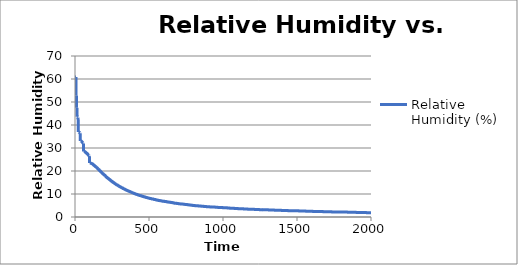
| Category | Relative Humidity (%) |
|---|---|
| 0.0 | 60.8 |
| 1.0 | 60.8 |
| 2.0 | 60.8 |
| 3.0 | 60.8 |
| 4.0 | 60.9 |
| 5.0 | 60.9 |
| 6.0 | 60.9 |
| 7.0 | 52.8 |
| 8.0 | 52.8 |
| 9.0 | 52.8 |
| 10.0 | 52.8 |
| 11.0 | 47.5 |
| 12.0 | 47.5 |
| 13.0 | 47.5 |
| 14.0 | 43.6 |
| 15.0 | 43.6 |
| 16.0 | 43.6 |
| 17.0 | 43.6 |
| 18.0 | 43.3 |
| 19.0 | 43.3 |
| 20.0 | 43.3 |
| 21.0 | 43.3 |
| 22.0 | 37 |
| 23.0 | 37 |
| 24.0 | 37 |
| 25.0 | 36.9 |
| 26.0 | 36.9 |
| 27.0 | 36.9 |
| 28.0 | 36.9 |
| 29.0 | 36.7 |
| 30.0 | 36.7 |
| 31.0 | 36.7 |
| 32.0 | 36.7 |
| 33.0 | 36.4 |
| 34.0 | 36.4 |
| 35.0 | 36.4 |
| 36.0 | 33.1 |
| 37.0 | 33.1 |
| 38.0 | 33.1 |
| 39.0 | 33.1 |
| 40.0 | 33 |
| 41.0 | 33 |
| 42.0 | 33 |
| 43.0 | 33 |
| 44.0 | 32.8 |
| 45.0 | 32.8 |
| 46.0 | 32.8 |
| 47.0 | 32.6 |
| 48.0 | 32.6 |
| 49.0 | 32.6 |
| 50.0 | 32.6 |
| 51.0 | 32.3 |
| 52.0 | 32.3 |
| 53.0 | 32.3 |
| 54.0 | 32 |
| 55.0 | 32 |
| 56.0 | 32 |
| 57.0 | 32 |
| 58.0 | 28.5 |
| 59.0 | 28.5 |
| 60.0 | 28.5 |
| 61.0 | 28.5 |
| 62.0 | 28.5 |
| 63.0 | 28.5 |
| 64.0 | 28.5 |
| 65.0 | 28.4 |
| 66.0 | 28.4 |
| 67.0 | 28.4 |
| 68.0 | 28.4 |
| 69.0 | 28.2 |
| 70.0 | 28.2 |
| 71.0 | 28.2 |
| 72.0 | 28.2 |
| 73.0 | 28 |
| 74.0 | 28 |
| 75.0 | 28 |
| 76.0 | 27.8 |
| 77.0 | 27.8 |
| 78.0 | 27.8 |
| 79.0 | 27.8 |
| 80.0 | 27.6 |
| 81.0 | 27.6 |
| 82.0 | 27.6 |
| 83.0 | 27.6 |
| 84.0 | 27.4 |
| 85.0 | 27.4 |
| 86.0 | 27.4 |
| 87.0 | 27.1 |
| 88.0 | 27.1 |
| 89.0 | 27.1 |
| 90.0 | 27.1 |
| 91.0 | 26.9 |
| 92.0 | 26.9 |
| 93.0 | 26.9 |
| 94.0 | 26.6 |
| 95.0 | 26.6 |
| 96.0 | 26.6 |
| 97.0 | 26.6 |
| 98.0 | 23.5 |
| 99.0 | 23.5 |
| 100.0 | 23.5 |
| 101.0 | 23.5 |
| 102.0 | 23.5 |
| 103.0 | 23.5 |
| 104.0 | 23.5 |
| 105.0 | 23.4 |
| 106.0 | 23.4 |
| 107.0 | 23.4 |
| 108.0 | 23.4 |
| 109.0 | 23.3 |
| 110.0 | 23.3 |
| 111.0 | 23.3 |
| 112.0 | 23.3 |
| 113.0 | 23.2 |
| 114.0 | 23.2 |
| 115.0 | 23.2 |
| 116.0 | 23.1 |
| 117.0 | 23.1 |
| 118.0 | 23.1 |
| 119.0 | 23.1 |
| 120.0 | 22.9 |
| 121.0 | 22.9 |
| 122.0 | 22.9 |
| 123.0 | 22.9 |
| 124.0 | 22.7 |
| 125.0 | 22.7 |
| 126.0 | 22.7 |
| 127.0 | 22.5 |
| 128.0 | 22.5 |
| 129.0 | 22.5 |
| 130.0 | 22.5 |
| 131.0 | 22.3 |
| 132.0 | 22.3 |
| 133.0 | 22.3 |
| 134.0 | 22.1 |
| 135.0 | 22.1 |
| 136.0 | 22.1 |
| 137.0 | 22.1 |
| 138.0 | 21.9 |
| 139.0 | 21.9 |
| 140.0 | 21.9 |
| 141.0 | 21.9 |
| 142.0 | 21.7 |
| 143.0 | 21.7 |
| 144.0 | 21.7 |
| 145.0 | 21.5 |
| 146.0 | 21.5 |
| 147.0 | 21.5 |
| 148.0 | 21.5 |
| 149.0 | 21.3 |
| 150.0 | 21.3 |
| 151.0 | 21.3 |
| 152.0 | 21.3 |
| 153.0 | 21 |
| 154.0 | 21 |
| 155.0 | 21 |
| 156.0 | 20.8 |
| 157.0 | 20.8 |
| 158.0 | 20.8 |
| 159.0 | 20.8 |
| 160.0 | 20.6 |
| 161.0 | 20.6 |
| 162.0 | 20.6 |
| 163.0 | 20.6 |
| 164.0 | 20.3 |
| 165.0 | 20.3 |
| 166.0 | 20.3 |
| 167.0 | 20.1 |
| 168.0 | 20.1 |
| 169.0 | 20.1 |
| 170.0 | 20.1 |
| 171.0 | 19.9 |
| 172.0 | 19.9 |
| 173.0 | 19.9 |
| 174.0 | 19.9 |
| 175.0 | 19.6 |
| 176.0 | 19.6 |
| 177.0 | 19.6 |
| 178.0 | 19.4 |
| 179.0 | 19.4 |
| 180.0 | 19.4 |
| 181.0 | 19.4 |
| 182.0 | 19.2 |
| 183.0 | 19.2 |
| 184.0 | 19.2 |
| 185.0 | 18.9 |
| 186.0 | 18.9 |
| 187.0 | 18.9 |
| 188.0 | 18.9 |
| 189.0 | 18.7 |
| 190.0 | 18.7 |
| 191.0 | 18.7 |
| 192.0 | 18.7 |
| 193.0 | 18.5 |
| 194.0 | 18.5 |
| 195.0 | 18.5 |
| 196.0 | 18.3 |
| 197.0 | 18.3 |
| 198.0 | 18.3 |
| 199.0 | 18.3 |
| 200.0 | 18.1 |
| 201.0 | 18.1 |
| 202.0 | 18.1 |
| 203.0 | 18.1 |
| 204.0 | 17.9 |
| 205.0 | 17.9 |
| 206.0 | 17.9 |
| 207.0 | 17.6 |
| 208.0 | 17.6 |
| 209.0 | 17.6 |
| 210.0 | 17.6 |
| 211.0 | 17.4 |
| 212.0 | 17.4 |
| 213.0 | 17.4 |
| 214.0 | 17.2 |
| 215.0 | 17.2 |
| 216.0 | 17.2 |
| 217.0 | 17.2 |
| 218.0 | 17 |
| 219.0 | 17 |
| 220.0 | 17 |
| 221.0 | 17 |
| 222.0 | 16.8 |
| 223.0 | 16.8 |
| 224.0 | 16.8 |
| 225.0 | 16.8 |
| 226.0 | 16.6 |
| 227.0 | 16.6 |
| 228.0 | 16.6 |
| 229.0 | 16.4 |
| 230.0 | 16.4 |
| 231.0 | 16.4 |
| 232.0 | 16.4 |
| 233.0 | 16.3 |
| 234.0 | 16.3 |
| 235.0 | 16.3 |
| 236.0 | 16.1 |
| 237.0 | 16.1 |
| 238.0 | 16.1 |
| 239.0 | 16.1 |
| 240.0 | 15.9 |
| 241.0 | 15.9 |
| 242.0 | 15.9 |
| 243.0 | 15.9 |
| 244.0 | 15.7 |
| 245.0 | 15.7 |
| 246.0 | 15.7 |
| 247.0 | 15.5 |
| 248.0 | 15.5 |
| 249.0 | 15.5 |
| 250.0 | 15.5 |
| 251.0 | 15.4 |
| 252.0 | 15.4 |
| 253.0 | 15.4 |
| 254.0 | 15.2 |
| 255.0 | 15.2 |
| 256.0 | 15.2 |
| 257.0 | 15.2 |
| 258.0 | 15 |
| 259.0 | 15 |
| 260.0 | 15 |
| 261.0 | 15 |
| 262.0 | 14.9 |
| 263.0 | 14.9 |
| 264.0 | 14.9 |
| 265.0 | 14.7 |
| 266.0 | 14.7 |
| 267.0 | 14.7 |
| 268.0 | 14.7 |
| 269.0 | 14.5 |
| 270.0 | 14.5 |
| 271.0 | 14.5 |
| 272.0 | 14.5 |
| 273.0 | 14.4 |
| 274.0 | 14.4 |
| 275.0 | 14.4 |
| 276.0 | 14.2 |
| 277.0 | 14.2 |
| 278.0 | 14.2 |
| 279.0 | 14.2 |
| 280.0 | 14 |
| 281.0 | 14 |
| 282.0 | 14 |
| 283.0 | 14 |
| 284.0 | 13.9 |
| 285.0 | 13.9 |
| 286.0 | 13.9 |
| 287.0 | 13.8 |
| 288.0 | 13.8 |
| 289.0 | 13.8 |
| 290.0 | 13.8 |
| 291.0 | 13.6 |
| 292.0 | 13.6 |
| 293.0 | 13.6 |
| 294.0 | 13.5 |
| 295.0 | 13.5 |
| 296.0 | 13.5 |
| 297.0 | 13.5 |
| 298.0 | 13.3 |
| 299.0 | 13.3 |
| 300.0 | 13.3 |
| 301.0 | 13.3 |
| 302.0 | 13.2 |
| 303.0 | 13.2 |
| 304.0 | 13.2 |
| 305.0 | 13.1 |
| 306.0 | 13.1 |
| 307.0 | 13.1 |
| 308.0 | 13.1 |
| 309.0 | 12.9 |
| 310.0 | 12.9 |
| 311.0 | 12.9 |
| 312.0 | 12.9 |
| 313.0 | 12.8 |
| 314.0 | 12.8 |
| 315.0 | 12.8 |
| 316.0 | 12.7 |
| 317.0 | 12.7 |
| 318.0 | 12.7 |
| 319.0 | 12.7 |
| 320.0 | 12.6 |
| 321.0 | 12.6 |
| 322.0 | 12.6 |
| 323.0 | 12.6 |
| 324.0 | 12.4 |
| 325.0 | 12.4 |
| 326.0 | 12.4 |
| 327.0 | 12.3 |
| 328.0 | 12.3 |
| 329.0 | 12.3 |
| 330.0 | 12.3 |
| 331.0 | 12.2 |
| 332.0 | 12.2 |
| 333.0 | 12.2 |
| 334.0 | 12.1 |
| 335.0 | 12.1 |
| 336.0 | 12.1 |
| 337.0 | 12.1 |
| 338.0 | 12 |
| 339.0 | 12 |
| 340.0 | 12 |
| 341.0 | 12 |
| 342.0 | 11.8 |
| 343.0 | 11.8 |
| 344.0 | 11.8 |
| 345.0 | 11.7 |
| 346.0 | 11.7 |
| 347.0 | 11.7 |
| 348.0 | 11.7 |
| 349.0 | 11.6 |
| 350.0 | 11.6 |
| 351.0 | 11.6 |
| 352.0 | 11.6 |
| 353.0 | 11.5 |
| 354.0 | 11.5 |
| 355.0 | 11.5 |
| 356.0 | 11.4 |
| 357.0 | 11.4 |
| 358.0 | 11.4 |
| 359.0 | 11.4 |
| 360.0 | 11.3 |
| 361.0 | 11.3 |
| 362.0 | 11.3 |
| 363.0 | 11.3 |
| 364.0 | 11.2 |
| 365.0 | 11.2 |
| 366.0 | 11.2 |
| 367.0 | 11.1 |
| 368.0 | 11.1 |
| 369.0 | 11.1 |
| 370.0 | 11.1 |
| 371.0 | 11 |
| 372.0 | 11 |
| 373.0 | 11 |
| 374.0 | 10.9 |
| 375.0 | 10.9 |
| 376.0 | 10.9 |
| 377.0 | 10.9 |
| 378.0 | 10.8 |
| 379.0 | 10.8 |
| 380.0 | 10.8 |
| 381.0 | 10.8 |
| 382.0 | 10.7 |
| 383.0 | 10.7 |
| 384.0 | 10.7 |
| 385.0 | 10.6 |
| 386.0 | 10.6 |
| 387.0 | 10.6 |
| 388.0 | 10.6 |
| 389.0 | 10.5 |
| 390.0 | 10.5 |
| 391.0 | 10.5 |
| 392.0 | 10.5 |
| 393.0 | 10.4 |
| 394.0 | 10.4 |
| 395.0 | 10.4 |
| 396.0 | 10.3 |
| 397.0 | 10.3 |
| 398.0 | 10.3 |
| 399.0 | 10.3 |
| 400.0 | 10.2 |
| 401.0 | 10.2 |
| 402.0 | 10.2 |
| 403.0 | 10.2 |
| 404.0 | 10.1 |
| 405.0 | 10.1 |
| 406.0 | 10.1 |
| 407.0 | 10 |
| 408.0 | 10 |
| 409.0 | 10 |
| 410.0 | 10 |
| 411.0 | 9.9 |
| 412.0 | 9.9 |
| 413.0 | 9.9 |
| 414.0 | 9.9 |
| 415.0 | 9.9 |
| 416.0 | 9.9 |
| 417.0 | 9.9 |
| 418.0 | 9.8 |
| 419.0 | 9.8 |
| 420.0 | 9.8 |
| 421.0 | 9.8 |
| 422.0 | 9.7 |
| 423.0 | 9.7 |
| 424.0 | 9.7 |
| 425.0 | 9.6 |
| 426.0 | 9.6 |
| 427.0 | 9.6 |
| 428.0 | 9.6 |
| 429.0 | 9.5 |
| 430.0 | 9.5 |
| 431.0 | 9.5 |
| 432.0 | 9.5 |
| 433.0 | 9.4 |
| 434.0 | 9.4 |
| 435.0 | 9.4 |
| 436.0 | 9.4 |
| 437.0 | 9.4 |
| 438.0 | 9.4 |
| 439.0 | 9.4 |
| 440.0 | 9.3 |
| 441.0 | 9.3 |
| 442.0 | 9.3 |
| 443.0 | 9.3 |
| 444.0 | 9.2 |
| 445.0 | 9.2 |
| 446.0 | 9.2 |
| 447.0 | 9.2 |
| 448.0 | 9.2 |
| 449.0 | 9.2 |
| 450.0 | 9.2 |
| 451.0 | 9.1 |
| 452.0 | 9.1 |
| 453.0 | 9.1 |
| 454.0 | 9 |
| 455.0 | 9 |
| 456.0 | 9 |
| 457.0 | 9 |
| 458.0 | 8.9 |
| 459.0 | 8.9 |
| 460.0 | 8.9 |
| 461.0 | 8.9 |
| 462.0 | 8.9 |
| 463.0 | 8.9 |
| 464.0 | 8.9 |
| 465.0 | 8.8 |
| 466.0 | 8.8 |
| 467.0 | 8.8 |
| 468.0 | 8.8 |
| 469.0 | 8.7 |
| 470.0 | 8.7 |
| 471.0 | 8.7 |
| 472.0 | 8.7 |
| 473.0 | 8.7 |
| 474.0 | 8.7 |
| 475.0 | 8.7 |
| 476.0 | 8.6 |
| 477.0 | 8.6 |
| 478.0 | 8.6 |
| 479.0 | 8.6 |
| 480.0 | 8.5 |
| 481.0 | 8.5 |
| 482.0 | 8.5 |
| 483.0 | 8.5 |
| 484.0 | 8.5 |
| 485.0 | 8.5 |
| 486.0 | 8.5 |
| 487.0 | 8.4 |
| 488.0 | 8.4 |
| 489.0 | 8.4 |
| 490.0 | 8.4 |
| 491.0 | 8.3 |
| 492.0 | 8.3 |
| 493.0 | 8.3 |
| 494.0 | 8.3 |
| 495.0 | 8.3 |
| 496.0 | 8.3 |
| 497.0 | 8.3 |
| 498.0 | 8.2 |
| 499.0 | 8.2 |
| 500.0 | 8.2 |
| 501.0 | 8.2 |
| 502.0 | 8.1 |
| 503.0 | 8.1 |
| 504.0 | 8.1 |
| 505.0 | 8.1 |
| 506.0 | 8.1 |
| 507.0 | 8.1 |
| 508.0 | 8.1 |
| 509.0 | 8 |
| 510.0 | 8 |
| 511.0 | 8 |
| 512.0 | 8 |
| 513.0 | 8 |
| 514.0 | 8 |
| 515.0 | 8 |
| 516.0 | 7.9 |
| 517.0 | 7.9 |
| 518.0 | 7.9 |
| 519.0 | 7.9 |
| 520.0 | 7.8 |
| 521.0 | 7.8 |
| 522.0 | 7.8 |
| 523.0 | 7.8 |
| 524.0 | 7.8 |
| 525.0 | 7.8 |
| 526.0 | 7.8 |
| 527.0 | 7.8 |
| 528.0 | 7.8 |
| 529.0 | 7.8 |
| 530.0 | 7.8 |
| 531.0 | 7.7 |
| 532.0 | 7.7 |
| 533.0 | 7.7 |
| 534.0 | 7.6 |
| 535.0 | 7.6 |
| 536.0 | 7.6 |
| 537.0 | 7.6 |
| 538.0 | 7.6 |
| 539.0 | 7.6 |
| 540.0 | 7.6 |
| 541.0 | 7.6 |
| 542.0 | 7.6 |
| 543.0 | 7.6 |
| 544.0 | 7.6 |
| 545.0 | 7.5 |
| 546.0 | 7.5 |
| 547.0 | 7.5 |
| 548.0 | 7.5 |
| 549.0 | 7.4 |
| 550.0 | 7.4 |
| 551.0 | 7.4 |
| 552.0 | 7.4 |
| 553.0 | 7.4 |
| 554.0 | 7.4 |
| 555.0 | 7.4 |
| 556.0 | 7.3 |
| 557.0 | 7.3 |
| 558.0 | 7.3 |
| 559.0 | 7.3 |
| 560.0 | 7.3 |
| 561.0 | 7.3 |
| 562.0 | 7.3 |
| 563.0 | 7.3 |
| 564.0 | 7.2 |
| 565.0 | 7.2 |
| 566.0 | 7.2 |
| 567.0 | 7.2 |
| 568.0 | 7.2 |
| 569.0 | 7.2 |
| 570.0 | 7.2 |
| 571.0 | 7.2 |
| 572.0 | 7.2 |
| 573.0 | 7.2 |
| 574.0 | 7.1 |
| 575.0 | 7.1 |
| 576.0 | 7.1 |
| 577.0 | 7.1 |
| 578.0 | 7.1 |
| 579.0 | 7.1 |
| 580.0 | 7.1 |
| 581.0 | 7.1 |
| 582.0 | 7 |
| 583.0 | 7 |
| 584.0 | 7 |
| 585.0 | 7 |
| 586.0 | 7 |
| 587.0 | 7 |
| 588.0 | 7 |
| 589.0 | 6.9 |
| 590.0 | 6.9 |
| 591.0 | 6.9 |
| 592.0 | 6.9 |
| 593.0 | 6.9 |
| 594.0 | 6.9 |
| 595.0 | 6.9 |
| 596.0 | 6.9 |
| 597.0 | 6.9 |
| 598.0 | 6.9 |
| 599.0 | 6.9 |
| 600.0 | 6.8 |
| 601.0 | 6.8 |
| 602.0 | 6.8 |
| 603.0 | 6.8 |
| 604.0 | 6.8 |
| 605.0 | 6.8 |
| 606.0 | 6.8 |
| 607.0 | 6.7 |
| 608.0 | 6.7 |
| 609.0 | 6.7 |
| 610.0 | 6.7 |
| 611.0 | 6.7 |
| 612.0 | 6.7 |
| 613.0 | 6.7 |
| 614.0 | 6.7 |
| 615.0 | 6.7 |
| 616.0 | 6.7 |
| 617.0 | 6.7 |
| 618.0 | 6.6 |
| 619.0 | 6.6 |
| 620.0 | 6.6 |
| 621.0 | 6.6 |
| 622.0 | 6.6 |
| 623.0 | 6.6 |
| 624.0 | 6.6 |
| 625.0 | 6.5 |
| 626.0 | 6.5 |
| 627.0 | 6.5 |
| 628.0 | 6.5 |
| 629.0 | 6.5 |
| 630.0 | 6.5 |
| 631.0 | 6.5 |
| 632.0 | 6.5 |
| 633.0 | 6.5 |
| 634.0 | 6.5 |
| 635.0 | 6.5 |
| 636.0 | 6.4 |
| 637.0 | 6.4 |
| 638.0 | 6.4 |
| 639.0 | 6.4 |
| 640.0 | 6.4 |
| 641.0 | 6.4 |
| 642.0 | 6.4 |
| 643.0 | 6.4 |
| 644.0 | 6.4 |
| 645.0 | 6.4 |
| 646.0 | 6.4 |
| 647.0 | 6.3 |
| 648.0 | 6.3 |
| 649.0 | 6.3 |
| 650.0 | 6.3 |
| 651.0 | 6.3 |
| 652.0 | 6.3 |
| 653.0 | 6.3 |
| 654.0 | 6.3 |
| 655.0 | 6.3 |
| 656.0 | 6.3 |
| 657.0 | 6.3 |
| 658.0 | 6.2 |
| 659.0 | 6.2 |
| 660.0 | 6.2 |
| 661.0 | 6.2 |
| 662.0 | 6.2 |
| 663.0 | 6.2 |
| 664.0 | 6.2 |
| 665.0 | 6.2 |
| 666.0 | 6.1 |
| 667.0 | 6.1 |
| 668.0 | 6.1 |
| 669.0 | 6.1 |
| 670.0 | 6.1 |
| 671.0 | 6.1 |
| 672.0 | 6.1 |
| 673.0 | 6 |
| 674.0 | 6 |
| 675.0 | 6 |
| 676.0 | 6 |
| 677.0 | 6 |
| 678.0 | 6 |
| 679.0 | 6 |
| 680.0 | 6 |
| 681.0 | 6 |
| 682.0 | 6 |
| 683.0 | 6 |
| 684.0 | 6 |
| 685.0 | 6 |
| 686.0 | 6 |
| 687.0 | 5.9 |
| 688.0 | 5.9 |
| 689.0 | 5.9 |
| 690.0 | 5.9 |
| 691.0 | 5.9 |
| 692.0 | 5.9 |
| 693.0 | 5.9 |
| 694.0 | 5.9 |
| 695.0 | 5.9 |
| 696.0 | 5.9 |
| 697.0 | 5.9 |
| 698.0 | 5.8 |
| 699.0 | 5.8 |
| 700.0 | 5.8 |
| 701.0 | 5.8 |
| 702.0 | 5.8 |
| 703.0 | 5.8 |
| 704.0 | 5.8 |
| 705.0 | 5.8 |
| 706.0 | 5.8 |
| 707.0 | 5.8 |
| 708.0 | 5.8 |
| 709.0 | 5.7 |
| 710.0 | 5.7 |
| 711.0 | 5.7 |
| 712.0 | 5.7 |
| 713.0 | 5.7 |
| 714.0 | 5.7 |
| 715.0 | 5.7 |
| 716.0 | 5.7 |
| 717.0 | 5.7 |
| 718.0 | 5.7 |
| 719.0 | 5.7 |
| 720.0 | 5.7 |
| 721.0 | 5.7 |
| 722.0 | 5.7 |
| 723.0 | 5.7 |
| 724.0 | 5.6 |
| 725.0 | 5.6 |
| 726.0 | 5.6 |
| 727.0 | 5.6 |
| 728.0 | 5.6 |
| 729.0 | 5.6 |
| 730.0 | 5.6 |
| 731.0 | 5.6 |
| 732.0 | 5.6 |
| 733.0 | 5.6 |
| 734.0 | 5.5 |
| 735.0 | 5.5 |
| 736.0 | 5.5 |
| 737.0 | 5.5 |
| 738.0 | 5.5 |
| 739.0 | 5.5 |
| 740.0 | 5.5 |
| 741.0 | 5.5 |
| 742.0 | 5.5 |
| 743.0 | 5.5 |
| 744.0 | 5.5 |
| 745.0 | 5.4 |
| 746.0 | 5.4 |
| 747.0 | 5.4 |
| 748.0 | 5.4 |
| 749.0 | 5.4 |
| 750.0 | 5.4 |
| 751.0 | 5.4 |
| 752.0 | 5.4 |
| 753.0 | 5.4 |
| 754.0 | 5.4 |
| 755.0 | 5.4 |
| 756.0 | 5.4 |
| 757.0 | 5.4 |
| 758.0 | 5.4 |
| 759.0 | 5.4 |
| 760.0 | 5.3 |
| 761.0 | 5.3 |
| 762.0 | 5.3 |
| 763.0 | 5.3 |
| 764.0 | 5.3 |
| 765.0 | 5.3 |
| 766.0 | 5.3 |
| 767.0 | 5.3 |
| 768.0 | 5.3 |
| 769.0 | 5.3 |
| 770.0 | 5.3 |
| 771.0 | 5.2 |
| 772.0 | 5.2 |
| 773.0 | 5.2 |
| 774.0 | 5.2 |
| 775.0 | 5.2 |
| 776.0 | 5.2 |
| 777.0 | 5.2 |
| 778.0 | 5.2 |
| 779.0 | 5.2 |
| 780.0 | 5.2 |
| 781.0 | 5.2 |
| 782.0 | 5.2 |
| 783.0 | 5.2 |
| 784.0 | 5.2 |
| 785.0 | 5.1 |
| 786.0 | 5.1 |
| 787.0 | 5.1 |
| 788.0 | 5.1 |
| 789.0 | 5.1 |
| 790.0 | 5.1 |
| 791.0 | 5.1 |
| 792.0 | 5.1 |
| 793.0 | 5.1 |
| 794.0 | 5.1 |
| 795.0 | 5.1 |
| 796.0 | 5 |
| 797.0 | 5 |
| 798.0 | 5 |
| 799.0 | 5 |
| 800.0 | 5 |
| 801.0 | 5 |
| 802.0 | 5 |
| 803.0 | 5 |
| 804.0 | 5 |
| 805.0 | 5 |
| 806.0 | 5 |
| 807.0 | 5 |
| 808.0 | 5 |
| 809.0 | 5 |
| 810.0 | 5 |
| 811.0 | 4.9 |
| 812.0 | 4.9 |
| 813.0 | 4.9 |
| 814.0 | 4.9 |
| 815.0 | 4.9 |
| 816.0 | 4.9 |
| 817.0 | 4.9 |
| 818.0 | 4.9 |
| 819.0 | 4.9 |
| 820.0 | 4.9 |
| 821.0 | 4.9 |
| 822.0 | 4.9 |
| 823.0 | 4.9 |
| 824.0 | 4.9 |
| 825.0 | 4.9 |
| 826.0 | 4.9 |
| 827.0 | 4.9 |
| 828.0 | 4.9 |
| 829.0 | 4.9 |
| 830.0 | 4.9 |
| 831.0 | 4.9 |
| 832.0 | 4.9 |
| 833.0 | 4.8 |
| 834.0 | 4.8 |
| 835.0 | 4.8 |
| 836.0 | 4.8 |
| 837.0 | 4.8 |
| 838.0 | 4.8 |
| 839.0 | 4.8 |
| 840.0 | 4.8 |
| 841.0 | 4.8 |
| 842.0 | 4.8 |
| 843.0 | 4.8 |
| 844.0 | 4.8 |
| 845.0 | 4.8 |
| 846.0 | 4.8 |
| 847.0 | 4.8 |
| 848.0 | 4.8 |
| 849.0 | 4.8 |
| 850.0 | 4.8 |
| 851.0 | 4.7 |
| 852.0 | 4.7 |
| 853.0 | 4.7 |
| 854.0 | 4.7 |
| 855.0 | 4.7 |
| 856.0 | 4.7 |
| 857.0 | 4.7 |
| 858.0 | 4.7 |
| 859.0 | 4.7 |
| 860.0 | 4.7 |
| 861.0 | 4.7 |
| 862.0 | 4.7 |
| 863.0 | 4.7 |
| 864.0 | 4.7 |
| 865.0 | 4.7 |
| 866.0 | 4.7 |
| 867.0 | 4.7 |
| 868.0 | 4.7 |
| 869.0 | 4.6 |
| 870.0 | 4.6 |
| 871.0 | 4.6 |
| 872.0 | 4.6 |
| 873.0 | 4.6 |
| 874.0 | 4.6 |
| 875.0 | 4.6 |
| 876.0 | 4.6 |
| 877.0 | 4.6 |
| 878.0 | 4.6 |
| 879.0 | 4.6 |
| 880.0 | 4.6 |
| 881.0 | 4.6 |
| 882.0 | 4.6 |
| 883.0 | 4.6 |
| 884.0 | 4.6 |
| 885.0 | 4.6 |
| 886.0 | 4.6 |
| 887.0 | 4.5 |
| 888.0 | 4.5 |
| 889.0 | 4.5 |
| 890.0 | 4.5 |
| 891.0 | 4.5 |
| 892.0 | 4.5 |
| 893.0 | 4.5 |
| 894.0 | 4.5 |
| 895.0 | 4.5 |
| 896.0 | 4.5 |
| 897.0 | 4.5 |
| 898.0 | 4.5 |
| 899.0 | 4.5 |
| 900.0 | 4.5 |
| 901.0 | 4.5 |
| 902.0 | 4.5 |
| 903.0 | 4.5 |
| 904.0 | 4.5 |
| 905.0 | 4.5 |
| 906.0 | 4.5 |
| 907.0 | 4.5 |
| 908.0 | 4.5 |
| 909.0 | 4.4 |
| 910.0 | 4.4 |
| 911.0 | 4.4 |
| 912.0 | 4.4 |
| 913.0 | 4.4 |
| 914.0 | 4.4 |
| 915.0 | 4.4 |
| 916.0 | 4.4 |
| 917.0 | 4.4 |
| 918.0 | 4.4 |
| 919.0 | 4.4 |
| 920.0 | 4.4 |
| 921.0 | 4.4 |
| 922.0 | 4.4 |
| 923.0 | 4.4 |
| 924.0 | 4.4 |
| 925.0 | 4.4 |
| 926.0 | 4.4 |
| 927.0 | 4.3 |
| 928.0 | 4.3 |
| 929.0 | 4.3 |
| 930.0 | 4.3 |
| 931.0 | 4.3 |
| 932.0 | 4.3 |
| 933.0 | 4.3 |
| 934.0 | 4.3 |
| 935.0 | 4.3 |
| 936.0 | 4.3 |
| 937.0 | 4.3 |
| 938.0 | 4.3 |
| 939.0 | 4.3 |
| 940.0 | 4.3 |
| 941.0 | 4.3 |
| 942.0 | 4.3 |
| 943.0 | 4.3 |
| 944.0 | 4.3 |
| 945.0 | 4.3 |
| 946.0 | 4.3 |
| 947.0 | 4.3 |
| 948.0 | 4.3 |
| 949.0 | 4.2 |
| 950.0 | 4.2 |
| 951.0 | 4.2 |
| 952.0 | 4.2 |
| 953.0 | 4.2 |
| 954.0 | 4.2 |
| 955.0 | 4.2 |
| 956.0 | 4.2 |
| 957.0 | 4.2 |
| 958.0 | 4.2 |
| 959.0 | 4.2 |
| 960.0 | 4.2 |
| 961.0 | 4.2 |
| 962.0 | 4.2 |
| 963.0 | 4.2 |
| 964.0 | 4.2 |
| 965.0 | 4.2 |
| 966.0 | 4.2 |
| 967.0 | 4.1 |
| 968.0 | 4.1 |
| 969.0 | 4.1 |
| 970.0 | 4.1 |
| 971.0 | 4.1 |
| 972.0 | 4.1 |
| 973.0 | 4.1 |
| 974.0 | 4.1 |
| 975.0 | 4.1 |
| 976.0 | 4.1 |
| 977.0 | 4.1 |
| 978.0 | 4.1 |
| 979.0 | 4.1 |
| 980.0 | 4.1 |
| 981.0 | 4.1 |
| 982.0 | 4.1 |
| 983.0 | 4.1 |
| 984.0 | 4.1 |
| 985.0 | 4.1 |
| 986.0 | 4.1 |
| 987.0 | 4.1 |
| 988.0 | 4.1 |
| 989.0 | 4.1 |
| 990.0 | 4.1 |
| 991.0 | 4.1 |
| 992.0 | 4.1 |
| 993.0 | 4.1 |
| 994.0 | 4.1 |
| 995.0 | 4.1 |
| 996.0 | 4.1 |
| 997.0 | 4.1 |
| 998.0 | 4.1 |
| 999.0 | 4.1 |
| 1000.0 | 4 |
| 1001.0 | 4 |
| 1002.0 | 4 |
| 1003.0 | 4 |
| 1004.0 | 4 |
| 1005.0 | 4 |
| 1006.0 | 4 |
| 1007.0 | 4 |
| 1008.0 | 4 |
| 1009.0 | 4 |
| 1010.0 | 4 |
| 1011.0 | 4 |
| 1012.0 | 4 |
| 1013.0 | 4 |
| 1014.0 | 4 |
| 1015.0 | 4 |
| 1016.0 | 4 |
| 1017.0 | 4 |
| 1018.0 | 4 |
| 1019.0 | 4 |
| 1020.0 | 4 |
| 1021.0 | 4 |
| 1022.0 | 4 |
| 1023.0 | 4 |
| 1024.0 | 4 |
| 1025.0 | 4 |
| 1026.0 | 4 |
| 1027.0 | 4 |
| 1028.0 | 4 |
| 1029.0 | 3.9 |
| 1030.0 | 3.9 |
| 1031.0 | 3.9 |
| 1032.0 | 3.9 |
| 1033.0 | 3.9 |
| 1034.0 | 3.9 |
| 1035.0 | 3.9 |
| 1036.0 | 3.9 |
| 1037.0 | 3.9 |
| 1038.0 | 3.9 |
| 1039.0 | 3.9 |
| 1040.0 | 3.9 |
| 1041.0 | 3.9 |
| 1042.0 | 3.9 |
| 1043.0 | 3.9 |
| 1044.0 | 3.9 |
| 1045.0 | 3.9 |
| 1046.0 | 3.9 |
| 1047.0 | 3.8 |
| 1048.0 | 3.8 |
| 1049.0 | 3.8 |
| 1050.0 | 3.8 |
| 1051.0 | 3.8 |
| 1052.0 | 3.8 |
| 1053.0 | 3.8 |
| 1054.0 | 3.8 |
| 1055.0 | 3.8 |
| 1056.0 | 3.8 |
| 1057.0 | 3.8 |
| 1058.0 | 3.8 |
| 1059.0 | 3.8 |
| 1060.0 | 3.8 |
| 1061.0 | 3.8 |
| 1062.0 | 3.8 |
| 1063.0 | 3.8 |
| 1064.0 | 3.8 |
| 1065.0 | 3.8 |
| 1066.0 | 3.8 |
| 1067.0 | 3.8 |
| 1068.0 | 3.8 |
| 1069.0 | 3.8 |
| 1070.0 | 3.8 |
| 1071.0 | 3.8 |
| 1072.0 | 3.8 |
| 1073.0 | 3.8 |
| 1074.0 | 3.8 |
| 1075.0 | 3.8 |
| 1076.0 | 3.7 |
| 1077.0 | 3.7 |
| 1078.0 | 3.7 |
| 1079.0 | 3.7 |
| 1080.0 | 3.7 |
| 1081.0 | 3.7 |
| 1082.0 | 3.7 |
| 1083.0 | 3.7 |
| 1084.0 | 3.7 |
| 1085.0 | 3.7 |
| 1086.0 | 3.7 |
| 1087.0 | 3.7 |
| 1088.0 | 3.7 |
| 1089.0 | 3.7 |
| 1090.0 | 3.7 |
| 1091.0 | 3.7 |
| 1092.0 | 3.7 |
| 1093.0 | 3.7 |
| 1094.0 | 3.7 |
| 1095.0 | 3.7 |
| 1096.0 | 3.7 |
| 1097.0 | 3.7 |
| 1098.0 | 3.7 |
| 1099.0 | 3.7 |
| 1100.0 | 3.7 |
| 1101.0 | 3.7 |
| 1102.0 | 3.6 |
| 1103.0 | 3.6 |
| 1104.0 | 3.6 |
| 1105.0 | 3.6 |
| 1106.0 | 3.6 |
| 1107.0 | 3.6 |
| 1108.0 | 3.6 |
| 1109.0 | 3.6 |
| 1110.0 | 3.6 |
| 1111.0 | 3.6 |
| 1112.0 | 3.6 |
| 1113.0 | 3.6 |
| 1114.0 | 3.6 |
| 1115.0 | 3.6 |
| 1116.0 | 3.6 |
| 1117.0 | 3.6 |
| 1118.0 | 3.6 |
| 1119.0 | 3.6 |
| 1120.0 | 3.6 |
| 1121.0 | 3.6 |
| 1122.0 | 3.6 |
| 1123.0 | 3.6 |
| 1124.0 | 3.6 |
| 1125.0 | 3.6 |
| 1126.0 | 3.6 |
| 1127.0 | 3.6 |
| 1128.0 | 3.6 |
| 1129.0 | 3.6 |
| 1130.0 | 3.6 |
| 1131.0 | 3.6 |
| 1132.0 | 3.6 |
| 1133.0 | 3.6 |
| 1134.0 | 3.6 |
| 1135.0 | 3.6 |
| 1136.0 | 3.6 |
| 1137.0 | 3.6 |
| 1138.0 | 3.5 |
| 1139.0 | 3.5 |
| 1140.0 | 3.5 |
| 1141.0 | 3.5 |
| 1142.0 | 3.5 |
| 1143.0 | 3.5 |
| 1144.0 | 3.5 |
| 1145.0 | 3.5 |
| 1146.0 | 3.5 |
| 1147.0 | 3.5 |
| 1148.0 | 3.5 |
| 1149.0 | 3.5 |
| 1150.0 | 3.5 |
| 1151.0 | 3.5 |
| 1152.0 | 3.5 |
| 1153.0 | 3.5 |
| 1154.0 | 3.5 |
| 1155.0 | 3.5 |
| 1156.0 | 3.5 |
| 1157.0 | 3.5 |
| 1158.0 | 3.5 |
| 1159.0 | 3.5 |
| 1160.0 | 3.5 |
| 1161.0 | 3.5 |
| 1162.0 | 3.5 |
| 1163.0 | 3.5 |
| 1164.0 | 3.5 |
| 1165.0 | 3.5 |
| 1166.0 | 3.5 |
| 1167.0 | 3.4 |
| 1168.0 | 3.4 |
| 1169.0 | 3.4 |
| 1170.0 | 3.4 |
| 1171.0 | 3.4 |
| 1172.0 | 3.4 |
| 1173.0 | 3.4 |
| 1174.0 | 3.4 |
| 1175.0 | 3.4 |
| 1176.0 | 3.4 |
| 1177.0 | 3.4 |
| 1178.0 | 3.4 |
| 1179.0 | 3.4 |
| 1180.0 | 3.4 |
| 1181.0 | 3.4 |
| 1182.0 | 3.4 |
| 1183.0 | 3.4 |
| 1184.0 | 3.4 |
| 1185.0 | 3.4 |
| 1186.0 | 3.4 |
| 1187.0 | 3.4 |
| 1188.0 | 3.4 |
| 1189.0 | 3.4 |
| 1190.0 | 3.4 |
| 1191.0 | 3.4 |
| 1192.0 | 3.4 |
| 1193.0 | 3.4 |
| 1194.0 | 3.4 |
| 1195.0 | 3.4 |
| 1196.0 | 3.4 |
| 1197.0 | 3.4 |
| 1198.0 | 3.4 |
| 1199.0 | 3.4 |
| 1200.0 | 3.4 |
| 1201.0 | 3.4 |
| 1202.0 | 3.4 |
| 1203.0 | 3.4 |
| 1204.0 | 3.4 |
| 1205.0 | 3.4 |
| 1206.0 | 3.4 |
| 1207.0 | 3.4 |
| 1208.0 | 3.4 |
| 1209.0 | 3.4 |
| 1210.0 | 3.4 |
| 1211.0 | 3.3 |
| 1212.0 | 3.3 |
| 1213.0 | 3.3 |
| 1214.0 | 3.3 |
| 1215.0 | 3.3 |
| 1216.0 | 3.3 |
| 1217.0 | 3.3 |
| 1218.0 | 3.3 |
| 1219.0 | 3.3 |
| 1220.0 | 3.3 |
| 1221.0 | 3.3 |
| 1222.0 | 3.3 |
| 1223.0 | 3.3 |
| 1224.0 | 3.3 |
| 1225.0 | 3.3 |
| 1226.0 | 3.3 |
| 1227.0 | 3.3 |
| 1228.0 | 3.3 |
| 1229.0 | 3.3 |
| 1230.0 | 3.3 |
| 1231.0 | 3.3 |
| 1232.0 | 3.3 |
| 1233.0 | 3.3 |
| 1234.0 | 3.3 |
| 1235.0 | 3.3 |
| 1236.0 | 3.3 |
| 1237.0 | 3.3 |
| 1238.0 | 3.3 |
| 1239.0 | 3.3 |
| 1240.0 | 3.3 |
| 1241.0 | 3.3 |
| 1242.0 | 3.3 |
| 1243.0 | 3.3 |
| 1244.0 | 3.2 |
| 1245.0 | 3.2 |
| 1246.0 | 3.2 |
| 1247.0 | 3.2 |
| 1248.0 | 3.2 |
| 1249.0 | 3.2 |
| 1250.0 | 3.2 |
| 1251.0 | 3.2 |
| 1252.0 | 3.2 |
| 1253.0 | 3.2 |
| 1254.0 | 3.2 |
| 1255.0 | 3.2 |
| 1256.0 | 3.2 |
| 1257.0 | 3.2 |
| 1258.0 | 3.2 |
| 1259.0 | 3.2 |
| 1260.0 | 3.2 |
| 1261.0 | 3.2 |
| 1262.0 | 3.2 |
| 1263.0 | 3.2 |
| 1264.0 | 3.2 |
| 1265.0 | 3.2 |
| 1266.0 | 3.2 |
| 1267.0 | 3.2 |
| 1268.0 | 3.2 |
| 1269.0 | 3.1 |
| 1270.0 | 3.1 |
| 1271.0 | 3.1 |
| 1272.0 | 3.1 |
| 1273.0 | 3.1 |
| 1274.0 | 3.1 |
| 1275.0 | 3.1 |
| 1276.0 | 3.1 |
| 1277.0 | 3.1 |
| 1278.0 | 3.1 |
| 1279.0 | 3.1 |
| 1280.0 | 3.1 |
| 1281.0 | 3.1 |
| 1282.0 | 3.1 |
| 1283.0 | 3.1 |
| 1284.0 | 3.1 |
| 1285.0 | 3.1 |
| 1286.0 | 3.1 |
| 1287.0 | 3.1 |
| 1288.0 | 3.1 |
| 1289.0 | 3.1 |
| 1290.0 | 3.1 |
| 1291.0 | 3.1 |
| 1292.0 | 3.1 |
| 1293.0 | 3.1 |
| 1294.0 | 3.1 |
| 1295.0 | 3.1 |
| 1296.0 | 3.1 |
| 1297.0 | 3.1 |
| 1298.0 | 3.1 |
| 1299.0 | 3.1 |
| 1300.0 | 3.1 |
| 1301.0 | 3.1 |
| 1302.0 | 3.1 |
| 1303.0 | 3.1 |
| 1304.0 | 3.1 |
| 1305.0 | 3.1 |
| 1306.0 | 3.1 |
| 1307.0 | 3.1 |
| 1308.0 | 3.1 |
| 1309.0 | 3 |
| 1310.0 | 3 |
| 1311.0 | 3 |
| 1312.0 | 3 |
| 1313.0 | 3 |
| 1314.0 | 3 |
| 1315.0 | 3 |
| 1316.0 | 3 |
| 1317.0 | 3 |
| 1318.0 | 3 |
| 1319.0 | 3 |
| 1320.0 | 3 |
| 1321.0 | 3 |
| 1322.0 | 3 |
| 1323.0 | 3 |
| 1324.0 | 3 |
| 1325.0 | 3 |
| 1326.0 | 3 |
| 1327.0 | 3 |
| 1328.0 | 3 |
| 1329.0 | 3 |
| 1330.0 | 3 |
| 1331.0 | 3 |
| 1332.0 | 3 |
| 1333.0 | 3 |
| 1334.0 | 3 |
| 1335.0 | 3 |
| 1336.0 | 3 |
| 1337.0 | 3 |
| 1338.0 | 3 |
| 1339.0 | 3 |
| 1340.0 | 3 |
| 1341.0 | 3 |
| 1342.0 | 3 |
| 1343.0 | 3 |
| 1344.0 | 3 |
| 1345.0 | 3 |
| 1346.0 | 3 |
| 1347.0 | 3 |
| 1348.0 | 3 |
| 1349.0 | 2.9 |
| 1350.0 | 2.9 |
| 1351.0 | 2.9 |
| 1352.0 | 2.9 |
| 1353.0 | 2.9 |
| 1354.0 | 2.9 |
| 1355.0 | 2.9 |
| 1356.0 | 2.9 |
| 1357.0 | 2.9 |
| 1358.0 | 2.9 |
| 1359.0 | 2.9 |
| 1360.0 | 2.9 |
| 1361.0 | 2.9 |
| 1362.0 | 2.9 |
| 1363.0 | 2.9 |
| 1364.0 | 2.9 |
| 1365.0 | 2.9 |
| 1366.0 | 2.9 |
| 1367.0 | 2.9 |
| 1368.0 | 2.9 |
| 1369.0 | 2.9 |
| 1370.0 | 2.9 |
| 1371.0 | 2.9 |
| 1372.0 | 2.9 |
| 1373.0 | 2.9 |
| 1374.0 | 2.9 |
| 1375.0 | 2.9 |
| 1376.0 | 2.9 |
| 1377.0 | 2.9 |
| 1378.0 | 2.9 |
| 1379.0 | 2.9 |
| 1380.0 | 2.9 |
| 1381.0 | 2.9 |
| 1382.0 | 2.9 |
| 1383.0 | 2.9 |
| 1384.0 | 2.9 |
| 1385.0 | 2.9 |
| 1386.0 | 2.9 |
| 1387.0 | 2.9 |
| 1388.0 | 2.9 |
| 1389.0 | 2.9 |
| 1390.0 | 2.9 |
| 1391.0 | 2.9 |
| 1392.0 | 2.9 |
| 1393.0 | 2.9 |
| 1394.0 | 2.9 |
| 1395.0 | 2.9 |
| 1396.0 | 2.8 |
| 1397.0 | 2.8 |
| 1398.0 | 2.8 |
| 1399.0 | 2.8 |
| 1400.0 | 2.8 |
| 1401.0 | 2.8 |
| 1402.0 | 2.8 |
| 1403.0 | 2.8 |
| 1404.0 | 2.8 |
| 1405.0 | 2.8 |
| 1406.0 | 2.8 |
| 1407.0 | 2.8 |
| 1408.0 | 2.8 |
| 1409.0 | 2.8 |
| 1410.0 | 2.8 |
| 1411.0 | 2.8 |
| 1412.0 | 2.8 |
| 1413.0 | 2.8 |
| 1414.0 | 2.8 |
| 1415.0 | 2.8 |
| 1416.0 | 2.8 |
| 1417.0 | 2.8 |
| 1418.0 | 2.8 |
| 1419.0 | 2.8 |
| 1420.0 | 2.8 |
| 1421.0 | 2.8 |
| 1422.0 | 2.8 |
| 1423.0 | 2.8 |
| 1424.0 | 2.8 |
| 1425.0 | 2.8 |
| 1426.0 | 2.8 |
| 1427.0 | 2.8 |
| 1428.0 | 2.8 |
| 1429.0 | 2.8 |
| 1430.0 | 2.8 |
| 1431.0 | 2.8 |
| 1432.0 | 2.8 |
| 1433.0 | 2.8 |
| 1434.0 | 2.8 |
| 1435.0 | 2.8 |
| 1436.0 | 2.8 |
| 1437.0 | 2.8 |
| 1438.0 | 2.8 |
| 1439.0 | 2.8 |
| 1440.0 | 2.7 |
| 1441.0 | 2.7 |
| 1442.0 | 2.7 |
| 1443.0 | 2.7 |
| 1444.0 | 2.7 |
| 1445.0 | 2.7 |
| 1446.0 | 2.7 |
| 1447.0 | 2.7 |
| 1448.0 | 2.7 |
| 1449.0 | 2.7 |
| 1450.0 | 2.7 |
| 1451.0 | 2.7 |
| 1452.0 | 2.7 |
| 1453.0 | 2.7 |
| 1454.0 | 2.7 |
| 1455.0 | 2.7 |
| 1456.0 | 2.7 |
| 1457.0 | 2.7 |
| 1458.0 | 2.7 |
| 1459.0 | 2.7 |
| 1460.0 | 2.7 |
| 1461.0 | 2.7 |
| 1462.0 | 2.7 |
| 1463.0 | 2.7 |
| 1464.0 | 2.7 |
| 1465.0 | 2.7 |
| 1466.0 | 2.7 |
| 1467.0 | 2.7 |
| 1468.0 | 2.7 |
| 1469.0 | 2.7 |
| 1470.0 | 2.7 |
| 1471.0 | 2.7 |
| 1472.0 | 2.7 |
| 1473.0 | 2.7 |
| 1474.0 | 2.7 |
| 1475.0 | 2.7 |
| 1476.0 | 2.7 |
| 1477.0 | 2.7 |
| 1478.0 | 2.7 |
| 1479.0 | 2.7 |
| 1480.0 | 2.7 |
| 1481.0 | 2.7 |
| 1482.0 | 2.7 |
| 1483.0 | 2.7 |
| 1484.0 | 2.7 |
| 1485.0 | 2.7 |
| 1486.0 | 2.7 |
| 1487.0 | 2.7 |
| 1488.0 | 2.7 |
| 1489.0 | 2.7 |
| 1490.0 | 2.7 |
| 1491.0 | 2.7 |
| 1492.0 | 2.7 |
| 1493.0 | 2.7 |
| 1494.0 | 2.7 |
| 1495.0 | 2.7 |
| 1496.0 | 2.7 |
| 1497.0 | 2.7 |
| 1498.0 | 2.7 |
| 1499.0 | 2.7 |
| 1500.0 | 2.7 |
| 1501.0 | 2.7 |
| 1502.0 | 2.7 |
| 1503.0 | 2.7 |
| 1504.0 | 2.7 |
| 1505.0 | 2.7 |
| 1506.0 | 2.7 |
| 1507.0 | 2.7 |
| 1508.0 | 2.7 |
| 1509.0 | 2.7 |
| 1510.0 | 2.7 |
| 1511.0 | 2.7 |
| 1512.0 | 2.7 |
| 1513.0 | 2.6 |
| 1514.0 | 2.6 |
| 1515.0 | 2.6 |
| 1516.0 | 2.6 |
| 1517.0 | 2.6 |
| 1518.0 | 2.6 |
| 1519.0 | 2.6 |
| 1520.0 | 2.6 |
| 1521.0 | 2.6 |
| 1522.0 | 2.6 |
| 1523.0 | 2.6 |
| 1524.0 | 2.6 |
| 1525.0 | 2.6 |
| 1526.0 | 2.6 |
| 1527.0 | 2.6 |
| 1528.0 | 2.6 |
| 1529.0 | 2.6 |
| 1530.0 | 2.6 |
| 1531.0 | 2.6 |
| 1532.0 | 2.6 |
| 1533.0 | 2.6 |
| 1534.0 | 2.6 |
| 1535.0 | 2.6 |
| 1536.0 | 2.6 |
| 1537.0 | 2.6 |
| 1538.0 | 2.6 |
| 1539.0 | 2.6 |
| 1540.0 | 2.6 |
| 1541.0 | 2.6 |
| 1542.0 | 2.6 |
| 1543.0 | 2.6 |
| 1544.0 | 2.6 |
| 1545.0 | 2.6 |
| 1546.0 | 2.6 |
| 1547.0 | 2.6 |
| 1548.0 | 2.6 |
| 1549.0 | 2.6 |
| 1550.0 | 2.6 |
| 1551.0 | 2.6 |
| 1552.0 | 2.6 |
| 1553.0 | 2.6 |
| 1554.0 | 2.6 |
| 1555.0 | 2.6 |
| 1556.0 | 2.6 |
| 1557.0 | 2.6 |
| 1558.0 | 2.6 |
| 1559.0 | 2.6 |
| 1560.0 | 2.5 |
| 1561.0 | 2.5 |
| 1562.0 | 2.5 |
| 1563.0 | 2.5 |
| 1564.0 | 2.5 |
| 1565.0 | 2.5 |
| 1566.0 | 2.5 |
| 1567.0 | 2.5 |
| 1568.0 | 2.5 |
| 1569.0 | 2.5 |
| 1570.0 | 2.5 |
| 1571.0 | 2.5 |
| 1572.0 | 2.5 |
| 1573.0 | 2.5 |
| 1574.0 | 2.5 |
| 1575.0 | 2.5 |
| 1576.0 | 2.5 |
| 1577.0 | 2.5 |
| 1578.0 | 2.5 |
| 1579.0 | 2.5 |
| 1580.0 | 2.5 |
| 1581.0 | 2.5 |
| 1582.0 | 2.5 |
| 1583.0 | 2.5 |
| 1584.0 | 2.5 |
| 1585.0 | 2.5 |
| 1586.0 | 2.5 |
| 1587.0 | 2.5 |
| 1588.0 | 2.5 |
| 1589.0 | 2.5 |
| 1590.0 | 2.5 |
| 1591.0 | 2.5 |
| 1592.0 | 2.5 |
| 1593.0 | 2.5 |
| 1594.0 | 2.5 |
| 1595.0 | 2.5 |
| 1596.0 | 2.5 |
| 1597.0 | 2.5 |
| 1598.0 | 2.5 |
| 1599.0 | 2.5 |
| 1600.0 | 2.5 |
| 1601.0 | 2.5 |
| 1602.0 | 2.5 |
| 1603.0 | 2.5 |
| 1604.0 | 2.5 |
| 1605.0 | 2.5 |
| 1606.0 | 2.5 |
| 1607.0 | 2.4 |
| 1608.0 | 2.4 |
| 1609.0 | 2.4 |
| 1610.0 | 2.4 |
| 1611.0 | 2.4 |
| 1612.0 | 2.4 |
| 1613.0 | 2.4 |
| 1614.0 | 2.4 |
| 1615.0 | 2.4 |
| 1616.0 | 2.4 |
| 1617.0 | 2.4 |
| 1618.0 | 2.4 |
| 1619.0 | 2.4 |
| 1620.0 | 2.4 |
| 1621.0 | 2.4 |
| 1622.0 | 2.4 |
| 1623.0 | 2.4 |
| 1624.0 | 2.4 |
| 1625.0 | 2.4 |
| 1626.0 | 2.4 |
| 1627.0 | 2.4 |
| 1628.0 | 2.4 |
| 1629.0 | 2.4 |
| 1630.0 | 2.4 |
| 1631.0 | 2.4 |
| 1632.0 | 2.4 |
| 1633.0 | 2.4 |
| 1634.0 | 2.4 |
| 1635.0 | 2.4 |
| 1636.0 | 2.4 |
| 1637.0 | 2.4 |
| 1638.0 | 2.4 |
| 1639.0 | 2.4 |
| 1640.0 | 2.4 |
| 1641.0 | 2.4 |
| 1642.0 | 2.4 |
| 1643.0 | 2.4 |
| 1644.0 | 2.4 |
| 1645.0 | 2.4 |
| 1646.0 | 2.4 |
| 1647.0 | 2.4 |
| 1648.0 | 2.4 |
| 1649.0 | 2.4 |
| 1650.0 | 2.4 |
| 1651.0 | 2.4 |
| 1652.0 | 2.4 |
| 1653.0 | 2.4 |
| 1654.0 | 2.4 |
| 1655.0 | 2.4 |
| 1656.0 | 2.4 |
| 1657.0 | 2.4 |
| 1658.0 | 2.4 |
| 1659.0 | 2.4 |
| 1660.0 | 2.4 |
| 1661.0 | 2.4 |
| 1662.0 | 2.4 |
| 1663.0 | 2.4 |
| 1664.0 | 2.4 |
| 1665.0 | 2.4 |
| 1666.0 | 2.4 |
| 1667.0 | 2.4 |
| 1668.0 | 2.4 |
| 1669.0 | 2.4 |
| 1670.0 | 2.4 |
| 1671.0 | 2.4 |
| 1672.0 | 2.4 |
| 1673.0 | 2.4 |
| 1674.0 | 2.4 |
| 1675.0 | 2.4 |
| 1676.0 | 2.3 |
| 1677.0 | 2.3 |
| 1678.0 | 2.3 |
| 1679.0 | 2.3 |
| 1680.0 | 2.3 |
| 1681.0 | 2.3 |
| 1682.0 | 2.3 |
| 1683.0 | 2.3 |
| 1684.0 | 2.3 |
| 1685.0 | 2.3 |
| 1686.0 | 2.3 |
| 1687.0 | 2.3 |
| 1688.0 | 2.3 |
| 1689.0 | 2.3 |
| 1690.0 | 2.3 |
| 1691.0 | 2.3 |
| 1692.0 | 2.3 |
| 1693.0 | 2.3 |
| 1694.0 | 2.3 |
| 1695.0 | 2.3 |
| 1696.0 | 2.3 |
| 1697.0 | 2.3 |
| 1698.0 | 2.3 |
| 1699.0 | 2.3 |
| 1700.0 | 2.3 |
| 1701.0 | 2.3 |
| 1702.0 | 2.3 |
| 1703.0 | 2.3 |
| 1704.0 | 2.3 |
| 1705.0 | 2.3 |
| 1706.0 | 2.3 |
| 1707.0 | 2.3 |
| 1708.0 | 2.3 |
| 1709.0 | 2.3 |
| 1710.0 | 2.3 |
| 1711.0 | 2.3 |
| 1712.0 | 2.3 |
| 1713.0 | 2.3 |
| 1714.0 | 2.3 |
| 1715.0 | 2.3 |
| 1716.0 | 2.3 |
| 1717.0 | 2.3 |
| 1718.0 | 2.3 |
| 1719.0 | 2.3 |
| 1720.0 | 2.3 |
| 1721.0 | 2.3 |
| 1722.0 | 2.3 |
| 1723.0 | 2.3 |
| 1724.0 | 2.3 |
| 1725.0 | 2.3 |
| 1726.0 | 2.3 |
| 1727.0 | 2.3 |
| 1728.0 | 2.3 |
| 1729.0 | 2.3 |
| 1730.0 | 2.3 |
| 1731.0 | 2.3 |
| 1732.0 | 2.3 |
| 1733.0 | 2.3 |
| 1734.0 | 2.3 |
| 1735.0 | 2.2 |
| 1736.0 | 2.2 |
| 1737.0 | 2.2 |
| 1738.0 | 2.2 |
| 1739.0 | 2.2 |
| 1740.0 | 2.2 |
| 1741.0 | 2.2 |
| 1742.0 | 2.2 |
| 1743.0 | 2.2 |
| 1744.0 | 2.2 |
| 1745.0 | 2.2 |
| 1746.0 | 2.2 |
| 1747.0 | 2.2 |
| 1748.0 | 2.2 |
| 1749.0 | 2.2 |
| 1750.0 | 2.2 |
| 1751.0 | 2.2 |
| 1752.0 | 2.2 |
| 1753.0 | 2.2 |
| 1754.0 | 2.2 |
| 1755.0 | 2.2 |
| 1756.0 | 2.2 |
| 1757.0 | 2.2 |
| 1758.0 | 2.2 |
| 1759.0 | 2.2 |
| 1760.0 | 2.2 |
| 1761.0 | 2.2 |
| 1762.0 | 2.2 |
| 1763.0 | 2.2 |
| 1764.0 | 2.2 |
| 1765.0 | 2.2 |
| 1766.0 | 2.2 |
| 1767.0 | 2.2 |
| 1768.0 | 2.2 |
| 1769.0 | 2.2 |
| 1770.0 | 2.2 |
| 1771.0 | 2.2 |
| 1772.0 | 2.2 |
| 1773.0 | 2.2 |
| 1774.0 | 2.2 |
| 1775.0 | 2.2 |
| 1776.0 | 2.2 |
| 1777.0 | 2.2 |
| 1778.0 | 2.2 |
| 1779.0 | 2.2 |
| 1780.0 | 2.2 |
| 1781.0 | 2.2 |
| 1782.0 | 2.2 |
| 1783.0 | 2.2 |
| 1784.0 | 2.2 |
| 1785.0 | 2.2 |
| 1786.0 | 2.2 |
| 1787.0 | 2.2 |
| 1788.0 | 2.2 |
| 1789.0 | 2.2 |
| 1790.0 | 2.2 |
| 1791.0 | 2.2 |
| 1792.0 | 2.2 |
| 1793.0 | 2.2 |
| 1794.0 | 2.2 |
| 1795.0 | 2.2 |
| 1796.0 | 2.2 |
| 1797.0 | 2.2 |
| 1798.0 | 2.2 |
| 1799.0 | 2.2 |
| 1800.0 | 2.2 |
| 1801.0 | 2.2 |
| 1802.0 | 2.2 |
| 1803.0 | 2.2 |
| 1804.0 | 2.2 |
| 1805.0 | 2.2 |
| 1806.0 | 2.2 |
| 1807.0 | 2.2 |
| 1808.0 | 2.2 |
| 1809.0 | 2.2 |
| 1810.0 | 2.2 |
| 1811.0 | 2.2 |
| 1812.0 | 2.2 |
| 1813.0 | 2.2 |
| 1814.0 | 2.2 |
| 1815.0 | 2.2 |
| 1816.0 | 2.2 |
| 1817.0 | 2.2 |
| 1818.0 | 2.2 |
| 1819.0 | 2.2 |
| 1820.0 | 2.2 |
| 1821.0 | 2.2 |
| 1822.0 | 2.2 |
| 1823.0 | 2.2 |
| 1824.0 | 2.2 |
| 1825.0 | 2.2 |
| 1826.0 | 2.2 |
| 1827.0 | 2.2 |
| 1828.0 | 2.2 |
| 1829.0 | 2.2 |
| 1830.0 | 2.2 |
| 1831.0 | 2.2 |
| 1832.0 | 2.2 |
| 1833.0 | 2.2 |
| 1834.0 | 2.2 |
| 1835.0 | 2.2 |
| 1836.0 | 2.2 |
| 1837.0 | 2.2 |
| 1838.0 | 2.2 |
| 1839.0 | 2.2 |
| 1840.0 | 2.1 |
| 1841.0 | 2.1 |
| 1842.0 | 2.1 |
| 1843.0 | 2.1 |
| 1844.0 | 2.1 |
| 1845.0 | 2.1 |
| 1846.0 | 2.1 |
| 1847.0 | 2.1 |
| 1848.0 | 2.1 |
| 1849.0 | 2.1 |
| 1850.0 | 2.1 |
| 1851.0 | 2.1 |
| 1852.0 | 2.1 |
| 1853.0 | 2.1 |
| 1854.0 | 2.1 |
| 1855.0 | 2.1 |
| 1856.0 | 2.1 |
| 1857.0 | 2.1 |
| 1858.0 | 2.1 |
| 1859.0 | 2.1 |
| 1860.0 | 2.1 |
| 1861.0 | 2.1 |
| 1862.0 | 2.1 |
| 1863.0 | 2.1 |
| 1864.0 | 2.1 |
| 1865.0 | 2.1 |
| 1866.0 | 2.1 |
| 1867.0 | 2.1 |
| 1868.0 | 2.1 |
| 1869.0 | 2.1 |
| 1870.0 | 2.1 |
| 1871.0 | 2.1 |
| 1872.0 | 2.1 |
| 1873.0 | 2.1 |
| 1874.0 | 2.1 |
| 1875.0 | 2.1 |
| 1876.0 | 2.1 |
| 1877.0 | 2.1 |
| 1878.0 | 2.1 |
| 1879.0 | 2.1 |
| 1880.0 | 2.1 |
| 1881.0 | 2.1 |
| 1882.0 | 2.1 |
| 1883.0 | 2.1 |
| 1884.0 | 2.1 |
| 1885.0 | 2.1 |
| 1886.0 | 2.1 |
| 1887.0 | 2.1 |
| 1888.0 | 2.1 |
| 1889.0 | 2.1 |
| 1890.0 | 2.1 |
| 1891.0 | 2.1 |
| 1892.0 | 2.1 |
| 1893.0 | 2.1 |
| 1894.0 | 2.1 |
| 1895.0 | 2.1 |
| 1896.0 | 2.1 |
| 1897.0 | 2.1 |
| 1898.0 | 2 |
| 1899.0 | 2 |
| 1900.0 | 2 |
| 1901.0 | 2 |
| 1902.0 | 2 |
| 1903.0 | 2 |
| 1904.0 | 2 |
| 1905.0 | 2 |
| 1906.0 | 2 |
| 1907.0 | 2 |
| 1908.0 | 2 |
| 1909.0 | 2 |
| 1910.0 | 2 |
| 1911.0 | 2 |
| 1912.0 | 2 |
| 1913.0 | 2 |
| 1914.0 | 2 |
| 1915.0 | 2 |
| 1916.0 | 2 |
| 1917.0 | 2 |
| 1918.0 | 2 |
| 1919.0 | 2 |
| 1920.0 | 2 |
| 1921.0 | 2 |
| 1922.0 | 2 |
| 1923.0 | 2 |
| 1924.0 | 2 |
| 1925.0 | 2 |
| 1926.0 | 2 |
| 1927.0 | 2 |
| 1928.0 | 2 |
| 1929.0 | 2 |
| 1930.0 | 2 |
| 1931.0 | 2 |
| 1932.0 | 2 |
| 1933.0 | 2 |
| 1934.0 | 2 |
| 1935.0 | 2 |
| 1936.0 | 2 |
| 1937.0 | 2 |
| 1938.0 | 2 |
| 1939.0 | 2 |
| 1940.0 | 2 |
| 1941.0 | 2 |
| 1942.0 | 2 |
| 1943.0 | 2 |
| 1944.0 | 2 |
| 1945.0 | 2 |
| 1946.0 | 2 |
| 1947.0 | 2 |
| 1948.0 | 2 |
| 1949.0 | 2 |
| 1950.0 | 2 |
| 1951.0 | 2 |
| 1952.0 | 2 |
| 1953.0 | 2 |
| 1954.0 | 2 |
| 1955.0 | 2 |
| 1956.0 | 2 |
| 1957.0 | 2 |
| 1958.0 | 2 |
| 1959.0 | 2 |
| 1960.0 | 2 |
| 1961.0 | 2 |
| 1962.0 | 2 |
| 1963.0 | 2 |
| 1964.0 | 2 |
| 1965.0 | 2 |
| 1966.0 | 2 |
| 1967.0 | 1.9 |
| 1968.0 | 1.9 |
| 1969.0 | 1.9 |
| 1970.0 | 1.9 |
| 1971.0 | 1.9 |
| 1972.0 | 1.9 |
| 1973.0 | 1.9 |
| 1974.0 | 1.9 |
| 1975.0 | 1.9 |
| 1976.0 | 1.9 |
| 1977.0 | 1.9 |
| 1978.0 | 1.9 |
| 1979.0 | 1.9 |
| 1980.0 | 1.9 |
| 1981.0 | 1.9 |
| 1982.0 | 1.9 |
| 1983.0 | 1.9 |
| 1984.0 | 1.9 |
| 1985.0 | 1.9 |
| 1986.0 | 1.9 |
| 1987.0 | 1.9 |
| 1988.0 | 1.9 |
| 1989.0 | 1.9 |
| 1990.0 | 1.9 |
| 1991.0 | 1.9 |
| 1992.0 | 1.9 |
| 1993.0 | 1.9 |
| 1994.0 | 1.9 |
| 1995.0 | 1.9 |
| 1996.0 | 1.9 |
| 1997.0 | 1.9 |
| 1998.0 | 1.9 |
| 1999.0 | 1.9 |
| 2000.0 | 1.9 |
| 2001.0 | 1.9 |
| 2002.0 | 1.9 |
| 2003.0 | 1.9 |
| 2004.0 | 1.9 |
| 2005.0 | 1.9 |
| 2006.0 | 1.9 |
| 2007.0 | 1.9 |
| 2008.0 | 1.9 |
| 2009.0 | 1.9 |
| 2010.0 | 1.9 |
| 2011.0 | 1.9 |
| 2012.0 | 1.9 |
| 2013.0 | 1.9 |
| 2014.0 | 1.9 |
| 2015.0 | 1.9 |
| 2016.0 | 1.9 |
| 2017.0 | 1.9 |
| 2018.0 | 1.9 |
| 2019.0 | 1.9 |
| 2020.0 | 1.9 |
| 2021.0 | 1.9 |
| 2022.0 | 1.9 |
| 2023.0 | 1.9 |
| 2024.0 | 1.9 |
| 2025.0 | 1.9 |
| 2026.0 | 1.9 |
| 2027.0 | 1.9 |
| 2028.0 | 1.9 |
| 2029.0 | 1.9 |
| 2030.0 | 1.9 |
| 2031.0 | 1.9 |
| 2032.0 | 1.9 |
| 2033.0 | 1.9 |
| 2034.0 | 1.9 |
| 2035.0 | 1.9 |
| 2036.0 | 1.9 |
| 2037.0 | 1.9 |
| 2038.0 | 1.9 |
| 2039.0 | 1.9 |
| 2040.0 | 1.9 |
| 2041.0 | 1.9 |
| 2042.0 | 1.9 |
| 2043.0 | 1.9 |
| 2044.0 | 1.9 |
| 2045.0 | 1.9 |
| 2046.0 | 1.9 |
| 2047.0 | 1.9 |
| 2048.0 | 1.9 |
| 2049.0 | 1.9 |
| 2050.0 | 1.9 |
| 2051.0 | 1.9 |
| 2052.0 | 1.9 |
| 2053.0 | 1.9 |
| 2054.0 | 1.9 |
| 2055.0 | 1.9 |
| 2056.0 | 1.9 |
| 2057.0 | 1.9 |
| 2058.0 | 1.9 |
| 2059.0 | 1.9 |
| 2060.0 | 1.9 |
| 2061.0 | 1.9 |
| 2062.0 | 1.9 |
| 2063.0 | 1.9 |
| 2064.0 | 1.9 |
| 2065.0 | 1.9 |
| 2066.0 | 1.9 |
| 2067.0 | 1.9 |
| 2068.0 | 1.9 |
| 2069.0 | 1.9 |
| 2070.0 | 1.9 |
| 2071.0 | 1.9 |
| 2072.0 | 1.9 |
| 2073.0 | 1.9 |
| 2074.0 | 1.9 |
| 2075.0 | 1.9 |
| 2076.0 | 1.9 |
| 2077.0 | 1.9 |
| 2078.0 | 1.9 |
| 2079.0 | 1.9 |
| 2080.0 | 1.9 |
| 2081.0 | 1.9 |
| 2082.0 | 1.9 |
| 2083.0 | 1.9 |
| 2084.0 | 1.9 |
| 2085.0 | 1.9 |
| 2086.0 | 1.9 |
| 2087.0 | 1.8 |
| 2088.0 | 1.8 |
| 2089.0 | 1.8 |
| 2090.0 | 1.8 |
| 2091.0 | 1.8 |
| 2092.0 | 1.8 |
| 2093.0 | 1.8 |
| 2094.0 | 1.8 |
| 2095.0 | 1.8 |
| 2096.0 | 1.8 |
| 2097.0 | 1.8 |
| 2098.0 | 1.8 |
| 2099.0 | 1.8 |
| 2100.0 | 1.8 |
| 2101.0 | 1.8 |
| 2102.0 | 1.8 |
| 2103.0 | 1.8 |
| 2104.0 | 1.8 |
| 2105.0 | 1.8 |
| 2106.0 | 1.8 |
| 2107.0 | 1.8 |
| 2108.0 | 1.8 |
| 2109.0 | 1.8 |
| 2110.0 | 1.8 |
| 2111.0 | 1.8 |
| 2112.0 | 1.8 |
| 2113.0 | 1.8 |
| 2114.0 | 1.8 |
| 2115.0 | 1.8 |
| 2116.0 | 1.8 |
| 2117.0 | 1.8 |
| 2118.0 | 1.8 |
| 2119.0 | 1.8 |
| 2120.0 | 1.8 |
| 2121.0 | 1.8 |
| 2122.0 | 1.8 |
| 2123.0 | 1.8 |
| 2124.0 | 1.8 |
| 2125.0 | 1.8 |
| 2126.0 | 1.8 |
| 2127.0 | 1.8 |
| 2128.0 | 1.8 |
| 2129.0 | 1.8 |
| 2130.0 | 1.8 |
| 2131.0 | 1.8 |
| 2132.0 | 1.8 |
| 2133.0 | 1.8 |
| 2134.0 | 1.8 |
| 2135.0 | 1.8 |
| 2136.0 | 1.8 |
| 2137.0 | 1.8 |
| 2138.0 | 1.8 |
| 2139.0 | 1.8 |
| 2140.0 | 1.8 |
| 2141.0 | 1.8 |
| 2142.0 | 1.8 |
| 2143.0 | 1.8 |
| 2144.0 | 1.8 |
| 2145.0 | 1.8 |
| 2146.0 | 1.8 |
| 2147.0 | 1.8 |
| 2148.0 | 1.8 |
| 2149.0 | 1.8 |
| 2150.0 | 1.8 |
| 2151.0 | 1.8 |
| 2152.0 | 1.8 |
| 2153.0 | 1.8 |
| 2154.0 | 1.8 |
| 2155.0 | 1.8 |
| 2156.0 | 1.8 |
| 2157.0 | 1.8 |
| 2158.0 | 1.8 |
| 2159.0 | 1.8 |
| 2160.0 | 1.8 |
| 2161.0 | 1.8 |
| 2162.0 | 1.8 |
| 2163.0 | 1.8 |
| 2164.0 | 1.8 |
| 2165.0 | 1.8 |
| 2166.0 | 1.8 |
| 2167.0 | 1.8 |
| 2168.0 | 1.8 |
| 2169.0 | 1.8 |
| 2170.0 | 1.8 |
| 2171.0 | 1.7 |
| 2172.0 | 1.7 |
| 2173.0 | 1.7 |
| 2174.0 | 1.7 |
| 2175.0 | 1.7 |
| 2176.0 | 1.7 |
| 2177.0 | 1.7 |
| 2178.0 | 1.7 |
| 2179.0 | 1.7 |
| 2180.0 | 1.7 |
| 2181.0 | 1.7 |
| 2182.0 | 1.7 |